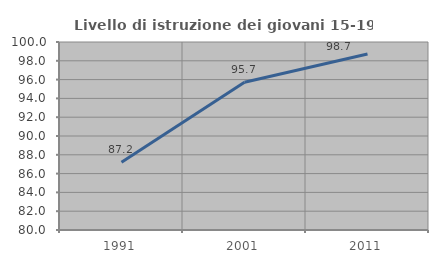
| Category | Livello di istruzione dei giovani 15-19 anni |
|---|---|
| 1991.0 | 87.215 |
| 2001.0 | 95.718 |
| 2011.0 | 98.726 |